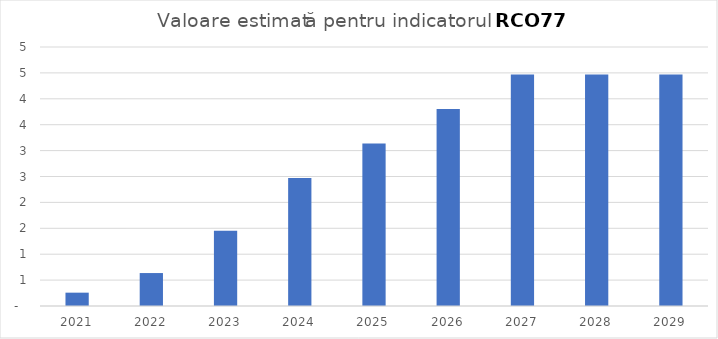
| Category | Series 0 |
|---|---|
| 2021.0 | 0.257 |
| 2022.0 | 0.636 |
| 2023.0 | 1.454 |
| 2024.0 | 2.469 |
| 2025.0 | 3.135 |
| 2026.0 | 3.802 |
| 2027.0 | 4.468 |
| 2028.0 | 4.468 |
| 2029.0 | 4.468 |